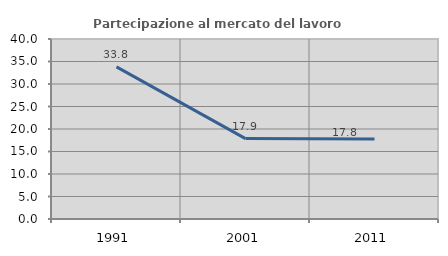
| Category | Partecipazione al mercato del lavoro  femminile |
|---|---|
| 1991.0 | 33.793 |
| 2001.0 | 17.872 |
| 2011.0 | 17.751 |